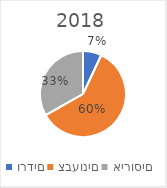
| Category | 2018 |
|---|---|
| ורדים | 0.07 |
| צבעונים | 0.6 |
| אירוסים | 0.333 |